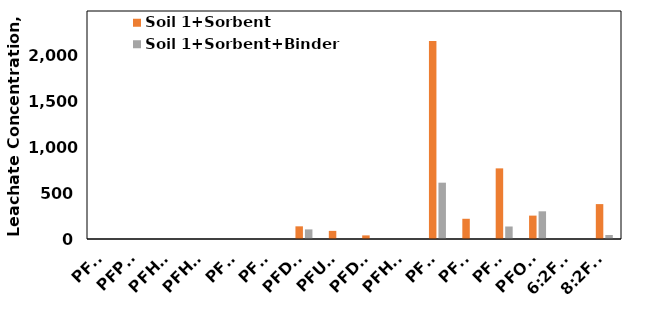
| Category | Soil 1+Sorbent | Soil 1+Sorbent+Binder |
|---|---|---|
| PFBA | 0 | 0 |
| PFPeA | 0 | 0 |
| PFHxA | 0 | 0 |
| PFHpA | 0 | 0 |
| PFOA | 0 | 0 |
| PFNA | 0 | 0 |
| PFDA | 138.382 | 104.938 |
| PFUnA | 88.662 | 0 |
| PFDoA | 39.379 | 0 |
| PFHxS | 0 | 0 |
| PFOS | 2163.082 | 615.017 |
| PFNS | 220.885 | 0 |
| PFDS | 771.394 | 136.629 |
| PFOSA | 255.395 | 302.408 |
| 6:2FTS | 0 | 0 |
| 8:2FTS | 381.135 | 43.782 |